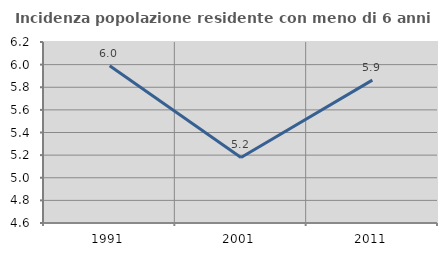
| Category | Incidenza popolazione residente con meno di 6 anni |
|---|---|
| 1991.0 | 5.991 |
| 2001.0 | 5.179 |
| 2011.0 | 5.863 |